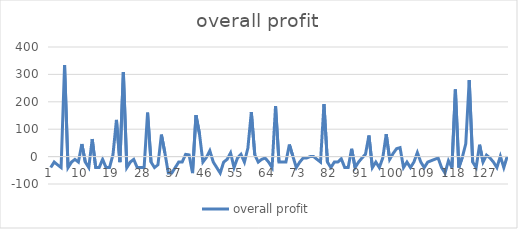
| Category | overall profit |
|---|---|
| 0 | -40 |
| 1 | -20 |
| 2 | -30 |
| 3 | -40 |
| 4 | 334.4 |
| 5 | -40 |
| 6 | -20 |
| 7 | -10 |
| 8 | -20 |
| 9 | 45.885 |
| 10 | -20 |
| 11 | -40 |
| 12 | 64.125 |
| 13 | -40 |
| 14 | -40 |
| 15 | -10 |
| 16 | -40 |
| 17 | -40 |
| 18 | 7.385 |
| 19 | 133.76 |
| 20 | -20 |
| 21 | 308.18 |
| 22 | -40 |
| 23 | -20 |
| 24 | -10 |
| 25 | -40 |
| 26 | -40 |
| 27 | -40 |
| 28 | 160.55 |
| 29 | -20 |
| 30 | -40 |
| 31 | -30 |
| 32 | 80.156 |
| 33 | 13.82 |
| 34 | -60 |
| 35 | -60 |
| 36 | -40 |
| 37 | -20 |
| 38 | -20 |
| 39 | 8.12 |
| 40 | 6.22 |
| 41 | -60 |
| 42 | 151.05 |
| 43 | 83.79 |
| 44 | -20 |
| 45 | -3.16 |
| 46 | 21.375 |
| 47 | -20 |
| 48 | -40 |
| 49 | -60 |
| 50 | -20 |
| 51 | -10 |
| 52 | 13.44 |
| 53 | -40 |
| 54 | -5 |
| 55 | 8.525 |
| 56 | -20 |
| 57 | 30.755 |
| 58 | 162.26 |
| 59 | 6.53 |
| 60 | -20 |
| 61 | -10 |
| 62 | -5.25 |
| 63 | -20 |
| 64 | -40 |
| 65 | 184.68 |
| 66 | -20 |
| 67 | -20 |
| 68 | -20 |
| 69 | 43.89 |
| 70 | 1.66 |
| 71 | -40 |
| 72 | -20 |
| 73 | -5 |
| 74 | -5 |
| 75 | 0 |
| 76 | 0 |
| 77 | -10 |
| 78 | -20 |
| 79 | 191.71 |
| 80 | -20 |
| 81 | -40 |
| 82 | -20 |
| 83 | -20 |
| 84 | -7.84 |
| 85 | -40 |
| 86 | -40 |
| 87 | 28.45 |
| 88 | -40 |
| 89 | -20 |
| 90 | -5 |
| 91 | 8.5 |
| 92 | 76.95 |
| 93 | -40 |
| 94 | -20 |
| 95 | -40 |
| 96 | -5 |
| 97 | 81.795 |
| 98 | -10 |
| 99 | 11.53 |
| 100 | 28.95 |
| 101 | 32.68 |
| 102 | -40 |
| 103 | -20 |
| 104 | -40 |
| 105 | -20 |
| 106 | 14.77 |
| 107 | -20 |
| 108 | -40 |
| 109 | -20 |
| 110 | -15 |
| 111 | -10 |
| 112 | -5 |
| 113 | -40 |
| 114 | -60 |
| 115 | -15 |
| 116 | -40 |
| 117 | 244.72 |
| 118 | -40 |
| 119 | -2.71 |
| 120 | 46.5 |
| 121 | 279.205 |
| 122 | -20 |
| 123 | -40 |
| 124 | 43.32 |
| 125 | -20 |
| 126 | 5.39 |
| 127 | -5 |
| 128 | -20 |
| 129 | -40 |
| 130 | 1.21 |
| 131 | -40 |
| 132 | 1.47 |